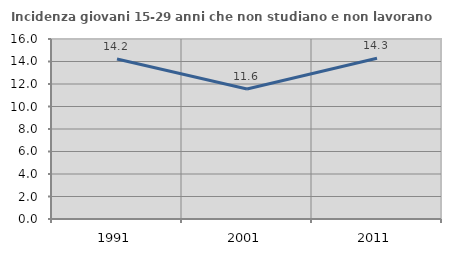
| Category | Incidenza giovani 15-29 anni che non studiano e non lavorano  |
|---|---|
| 1991.0 | 14.223 |
| 2001.0 | 11.552 |
| 2011.0 | 14.286 |